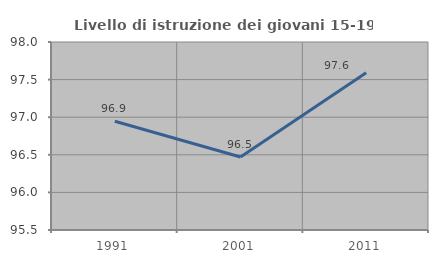
| Category | Livello di istruzione dei giovani 15-19 anni |
|---|---|
| 1991.0 | 96.947 |
| 2001.0 | 96.471 |
| 2011.0 | 97.59 |